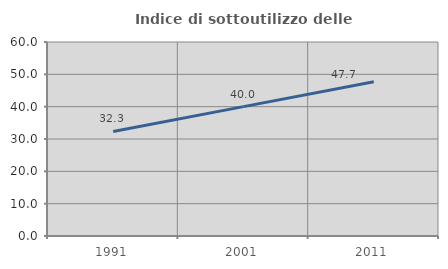
| Category | Indice di sottoutilizzo delle abitazioni  |
|---|---|
| 1991.0 | 32.328 |
| 2001.0 | 40.02 |
| 2011.0 | 47.685 |